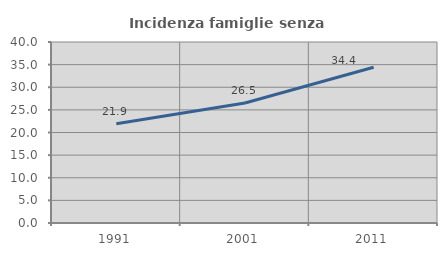
| Category | Incidenza famiglie senza nuclei |
|---|---|
| 1991.0 | 21.911 |
| 2001.0 | 26.517 |
| 2011.0 | 34.425 |